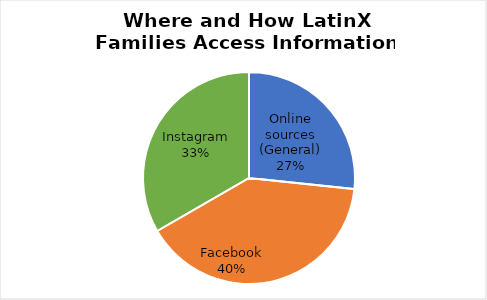
| Category | Where and How LatinX Families Access Information |
|---|---|
| Online sources (General) | 0.4 |
| Facebook | 0.6 |
| Instagram | 0.5 |